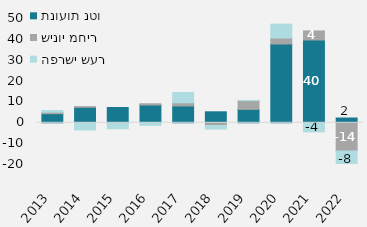
| Category | תנועות נטו | שינוי מחיר | הפרשי שער | #REF! |
|---|---|---|---|---|
| 2013 | 4357.041 | 703.092 | 824.066 |  |
| 2014 | 7395.537 | 341.401 | -3425.528 |  |
| 2015 | 7329.58 | -228.457 | -2627.507 |  |
| 2016 | 8528.929 | 591.666 | -1248.608 |  |
| 2017 | 8080.193 | 1522.047 | 4962.482 |  |
| 2018 | 5274.761 | -1305.442 | -1701.363 |  |
| 2019 | 6444.801 | 4170.168 | 119.784 |  |
| 2020 | 37776.483 | 2866.303 | 6640.065 |  |
| 2021 | 39703.618 | 4341.294 | -4349.484 |  |
| 2022 | 2291 | -13513 | -7552 |  |